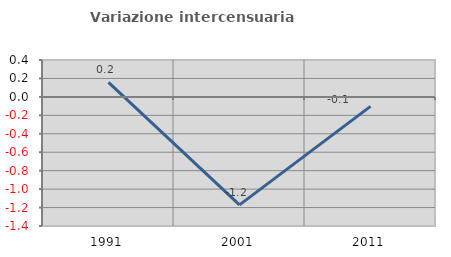
| Category | Variazione intercensuaria annua |
|---|---|
| 1991.0 | 0.158 |
| 2001.0 | -1.171 |
| 2011.0 | -0.102 |